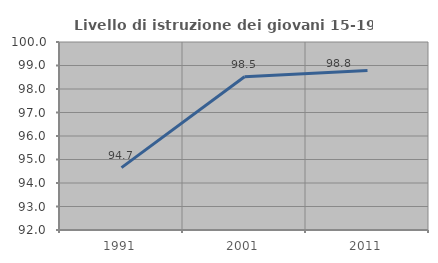
| Category | Livello di istruzione dei giovani 15-19 anni |
|---|---|
| 1991.0 | 94.654 |
| 2001.0 | 98.522 |
| 2011.0 | 98.785 |